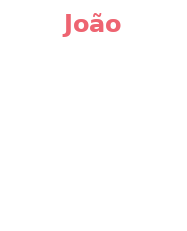
| Category | João |
|---|---|
| 0 | 0 |
| 1 | 0 |